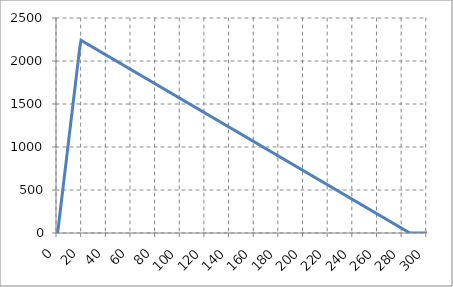
| Category | Snelheid |
|---|---|
| 0.0 | 0 |
| 1.0 | 120 |
| 2.0 | 240 |
| 3.0 | 360 |
| 4.0 | 480 |
| 5.0 | 600 |
| 6.0 | 720 |
| 7.0 | 840 |
| 8.0 | 960 |
| 9.0 | 1080 |
| 10.0 | 1200 |
| 11.0 | 1320 |
| 12.0 | 1440 |
| 13.0 | 1560 |
| 14.0 | 1680 |
| 15.0 | 1800 |
| 16.0 | 1920 |
| 17.0 | 2040 |
| 18.0 | 2160 |
| 19.0 | 2240.4 |
| 20.0 | 2232 |
| 21.0 | 2223.6 |
| 22.0 | 2215.2 |
| 23.0 | 2206.8 |
| 24.0 | 2198.4 |
| 25.0 | 2190 |
| 26.0 | 2181.6 |
| 27.0 | 2173.2 |
| 28.0 | 2164.8 |
| 29.0 | 2156.4 |
| 30.0 | 2148 |
| 31.0 | 2139.6 |
| 32.0 | 2131.2 |
| 33.0 | 2122.8 |
| 34.0 | 2114.4 |
| 35.0 | 2106 |
| 36.0 | 2097.6 |
| 37.0 | 2089.2 |
| 38.0 | 2080.8 |
| 39.0 | 2072.4 |
| 40.0 | 2064 |
| 41.0 | 2055.6 |
| 42.0 | 2047.2 |
| 43.0 | 2038.8 |
| 44.0 | 2030.4 |
| 45.0 | 2022 |
| 46.0 | 2013.6 |
| 47.0 | 2005.2 |
| 48.0 | 1996.8 |
| 49.0 | 1988.4 |
| 50.0 | 1980 |
| 51.0 | 1971.6 |
| 52.0 | 1963.2 |
| 53.0 | 1954.8 |
| 54.0 | 1946.4 |
| 55.0 | 1938 |
| 56.0 | 1929.6 |
| 57.0 | 1921.2 |
| 58.0 | 1912.8 |
| 59.0 | 1904.4 |
| 60.0 | 1896 |
| 61.0 | 1887.6 |
| 62.0 | 1879.2 |
| 63.0 | 1870.8 |
| 64.0 | 1862.4 |
| 65.0 | 1854 |
| 66.0 | 1845.6 |
| 67.0 | 1837.2 |
| 68.0 | 1828.8 |
| 69.0 | 1820.4 |
| 70.0 | 1812 |
| 71.0 | 1803.6 |
| 72.0 | 1795.2 |
| 73.0 | 1786.8 |
| 74.0 | 1778.4 |
| 75.0 | 1770 |
| 76.0 | 1761.6 |
| 77.0 | 1753.2 |
| 78.0 | 1744.8 |
| 79.0 | 1736.4 |
| 80.0 | 1728 |
| 81.0 | 1719.6 |
| 82.0 | 1711.2 |
| 83.0 | 1702.8 |
| 84.0 | 1694.4 |
| 85.0 | 1686 |
| 86.0 | 1677.6 |
| 87.0 | 1669.2 |
| 88.0 | 1660.8 |
| 89.0 | 1652.4 |
| 90.0 | 1644 |
| 91.0 | 1635.6 |
| 92.0 | 1627.2 |
| 93.0 | 1618.8 |
| 94.0 | 1610.4 |
| 95.0 | 1602 |
| 96.0 | 1593.6 |
| 97.0 | 1585.2 |
| 98.0 | 1576.8 |
| 99.0 | 1568.4 |
| 100.0 | 1560 |
| 101.0 | 1551.6 |
| 102.0 | 1543.2 |
| 103.0 | 1534.8 |
| 104.0 | 1526.4 |
| 105.0 | 1518 |
| 106.0 | 1509.6 |
| 107.0 | 1501.2 |
| 108.0 | 1492.8 |
| 109.0 | 1484.4 |
| 110.0 | 1476 |
| 111.0 | 1467.6 |
| 112.0 | 1459.2 |
| 113.0 | 1450.8 |
| 114.0 | 1442.4 |
| 115.0 | 1434 |
| 116.0 | 1425.6 |
| 117.0 | 1417.2 |
| 118.0 | 1408.8 |
| 119.0 | 1400.4 |
| 120.0 | 1392 |
| 121.0 | 1383.6 |
| 122.0 | 1375.2 |
| 123.0 | 1366.8 |
| 124.0 | 1358.4 |
| 125.0 | 1350 |
| 126.0 | 1341.6 |
| 127.0 | 1333.2 |
| 128.0 | 1324.8 |
| 129.0 | 1316.4 |
| 130.0 | 1308 |
| 131.0 | 1299.6 |
| 132.0 | 1291.2 |
| 133.0 | 1282.8 |
| 134.0 | 1274.4 |
| 135.0 | 1266 |
| 136.0 | 1257.6 |
| 137.0 | 1249.2 |
| 138.0 | 1240.8 |
| 139.0 | 1232.4 |
| 140.0 | 1224 |
| 141.0 | 1215.6 |
| 142.0 | 1207.2 |
| 143.0 | 1198.8 |
| 144.0 | 1190.4 |
| 145.0 | 1182 |
| 146.0 | 1173.6 |
| 147.0 | 1165.2 |
| 148.0 | 1156.8 |
| 149.0 | 1148.4 |
| 150.0 | 1140 |
| 151.0 | 1131.6 |
| 152.0 | 1123.2 |
| 153.0 | 1114.8 |
| 154.0 | 1106.4 |
| 155.0 | 1098 |
| 156.0 | 1089.6 |
| 157.0 | 1081.2 |
| 158.0 | 1072.8 |
| 159.0 | 1064.4 |
| 160.0 | 1056 |
| 161.0 | 1047.6 |
| 162.0 | 1039.2 |
| 163.0 | 1030.8 |
| 164.0 | 1022.4 |
| 165.0 | 1014 |
| 166.0 | 1005.6 |
| 167.0 | 997.2 |
| 168.0 | 988.8 |
| 169.0 | 980.4 |
| 170.0 | 972 |
| 171.0 | 963.6 |
| 172.0 | 955.2 |
| 173.0 | 946.8 |
| 174.0 | 938.4 |
| 175.0 | 930 |
| 176.0 | 921.6 |
| 177.0 | 913.2 |
| 178.0 | 904.8 |
| 179.0 | 896.4 |
| 180.0 | 888 |
| 181.0 | 879.6 |
| 182.0 | 871.2 |
| 183.0 | 862.8 |
| 184.0 | 854.4 |
| 185.0 | 846 |
| 186.0 | 837.6 |
| 187.0 | 829.2 |
| 188.0 | 820.8 |
| 189.0 | 812.4 |
| 190.0 | 804 |
| 191.0 | 795.6 |
| 192.0 | 787.2 |
| 193.0 | 778.8 |
| 194.0 | 770.4 |
| 195.0 | 762 |
| 196.0 | 753.6 |
| 197.0 | 745.2 |
| 198.0 | 736.8 |
| 199.0 | 728.4 |
| 200.0 | 720 |
| 201.0 | 711.6 |
| 202.0 | 703.2 |
| 203.0 | 694.8 |
| 204.0 | 686.4 |
| 205.0 | 678 |
| 206.0 | 669.6 |
| 207.0 | 661.2 |
| 208.0 | 652.8 |
| 209.0 | 644.4 |
| 210.0 | 636 |
| 211.0 | 627.6 |
| 212.0 | 619.2 |
| 213.0 | 610.8 |
| 214.0 | 602.4 |
| 215.0 | 594 |
| 216.0 | 585.6 |
| 217.0 | 577.2 |
| 218.0 | 568.8 |
| 219.0 | 560.4 |
| 220.0 | 552 |
| 221.0 | 543.6 |
| 222.0 | 535.2 |
| 223.0 | 526.8 |
| 224.0 | 518.4 |
| 225.0 | 510 |
| 226.0 | 501.6 |
| 227.0 | 493.2 |
| 228.0 | 484.8 |
| 229.0 | 476.4 |
| 230.0 | 468 |
| 231.0 | 459.6 |
| 232.0 | 451.2 |
| 233.0 | 442.8 |
| 234.0 | 434.4 |
| 235.0 | 426 |
| 236.0 | 417.6 |
| 237.0 | 409.2 |
| 238.0 | 400.8 |
| 239.0 | 392.4 |
| 240.0 | 384 |
| 241.0 | 375.6 |
| 242.0 | 367.2 |
| 243.0 | 358.8 |
| 244.0 | 350.4 |
| 245.0 | 342 |
| 246.0 | 333.6 |
| 247.0 | 325.2 |
| 248.0 | 316.8 |
| 249.0 | 308.4 |
| 250.0 | 300 |
| 251.0 | 291.6 |
| 252.0 | 283.2 |
| 253.0 | 274.8 |
| 254.0 | 266.4 |
| 255.0 | 258 |
| 256.0 | 249.6 |
| 257.0 | 241.2 |
| 258.0 | 232.8 |
| 259.0 | 224.4 |
| 260.0 | 216 |
| 261.0 | 207.6 |
| 262.0 | 199.2 |
| 263.0 | 190.8 |
| 264.0 | 182.4 |
| 265.0 | 174 |
| 266.0 | 165.6 |
| 267.0 | 157.2 |
| 268.0 | 148.8 |
| 269.0 | 140.4 |
| 270.0 | 132 |
| 271.0 | 123.6 |
| 272.0 | 115.2 |
| 273.0 | 106.8 |
| 274.0 | 98.4 |
| 275.0 | 90 |
| 276.0 | 81.6 |
| 277.0 | 73.2 |
| 278.0 | 64.8 |
| 279.0 | 56.4 |
| 280.0 | 48 |
| 281.0 | 39.6 |
| 282.0 | 31.2 |
| 283.0 | 22.8 |
| 284.0 | 14.4 |
| 285.0 | 6 |
| 286.0 | 0 |
| 287.0 | 0 |
| 288.0 | 0 |
| 289.0 | 0 |
| 290.0 | 0 |
| 291.0 | 0 |
| 292.0 | 0 |
| 293.0 | 0 |
| 294.0 | 0 |
| 295.0 | 0 |
| 296.0 | 0 |
| 297.0 | 0 |
| 298.0 | 0 |
| 299.0 | 0 |
| 300.0 | 0 |